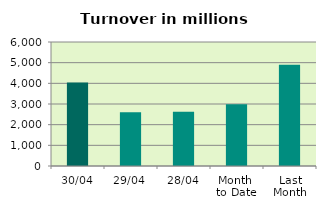
| Category | Series 0 |
|---|---|
| 30/04 | 4036.112 |
| 29/04 | 2605.967 |
| 28/04 | 2621.257 |
| Month 
to Date | 2985.476 |
| Last
Month | 4897.629 |